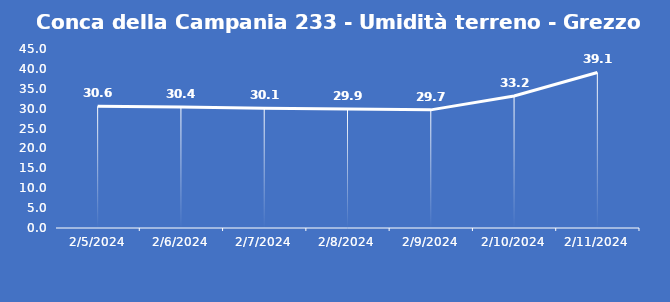
| Category | Conca della Campania 233 - Umidità terreno - Grezzo (%VWC) |
|---|---|
| 2/5/24 | 30.6 |
| 2/6/24 | 30.4 |
| 2/7/24 | 30.1 |
| 2/8/24 | 29.9 |
| 2/9/24 | 29.7 |
| 2/10/24 | 33.2 |
| 2/11/24 | 39.1 |